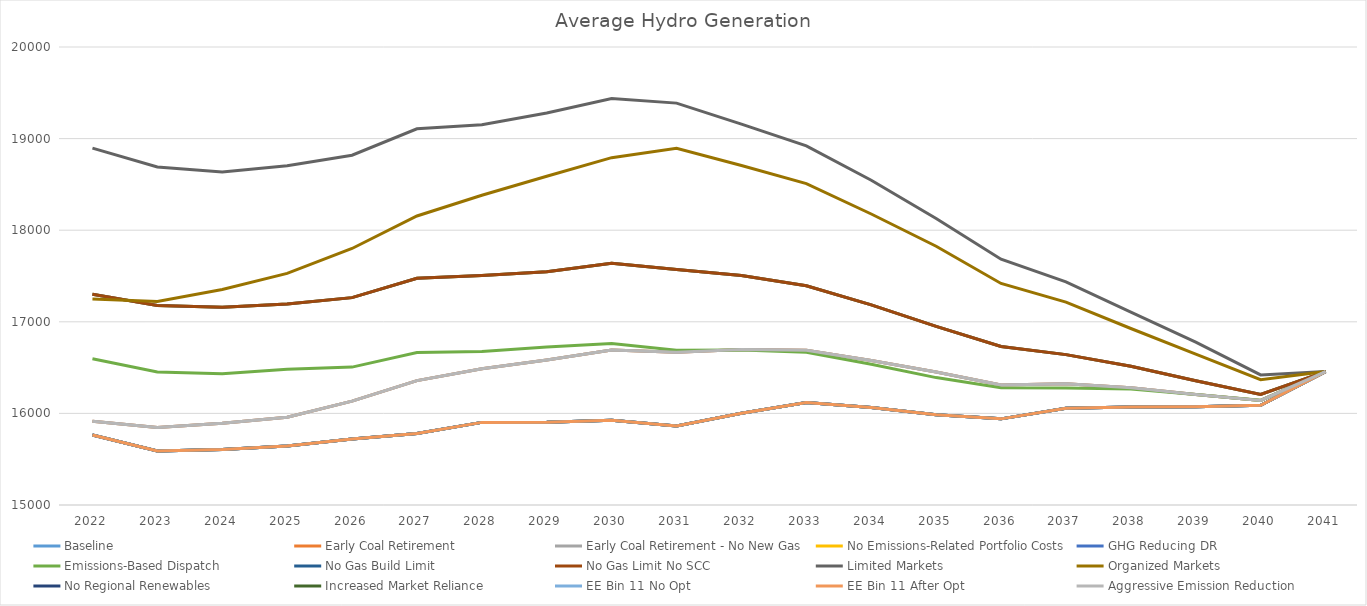
| Category | Baseline  | Early Coal Retirement | Early Coal Retirement - No New Gas | No Emissions-Related Portfolio Costs | GHG Reducing DR | Emissions-Based Dispatch | No Gas Build Limit | No Gas Limit No SCC | Limited Markets | Organized Markets | No Regional Renewables | Increased Market Reliance | EE Bin 11 No Opt | EE Bin 11 After Opt | Aggressive Emission Reduction |
|---|---|---|---|---|---|---|---|---|---|---|---|---|---|---|---|
| 2022.0 | 15764.597 | 15913.661 | 15913.661 | 17300.136 | 15764.597 | 16596.935 | 17300.136 | 17300.136 | 18896.162 | 17249.043 | 15764.597 | 15764.597 | 15764.597 | 15764.597 | 15913.661 |
| 2023.0 | 15589.564 | 15846.044 | 15846.044 | 17179.11 | 15589.564 | 16451.572 | 17179.11 | 17179.11 | 18690.465 | 17220.585 | 15589.564 | 15589.564 | 15589.564 | 15589.564 | 15846.044 |
| 2024.0 | 15606.932 | 15892.932 | 15892.932 | 17157.839 | 15606.932 | 16433.091 | 17157.839 | 17157.839 | 18634.977 | 17353.576 | 15606.932 | 15606.932 | 15606.932 | 15606.932 | 15892.932 |
| 2025.0 | 15645.328 | 15958.127 | 15958.127 | 17195.266 | 15645.328 | 16481.959 | 17195.266 | 17195.266 | 18704.343 | 17528.263 | 15645.328 | 15645.328 | 15645.328 | 15645.328 | 15958.127 |
| 2026.0 | 15720.863 | 16133.783 | 16133.783 | 17263.757 | 15720.863 | 16505.414 | 17263.757 | 17263.757 | 18818.205 | 17800.334 | 15720.863 | 15720.863 | 15720.863 | 15720.863 | 16133.783 |
| 2027.0 | 15781.453 | 16357.743 | 16357.743 | 17475.796 | 15781.453 | 16664.855 | 17475.796 | 17475.796 | 19106.494 | 18155.148 | 15781.453 | 15781.453 | 15781.453 | 15781.453 | 16357.743 |
| 2028.0 | 15901.912 | 16487.674 | 16487.674 | 17506.134 | 15901.912 | 16677.015 | 17506.134 | 17506.134 | 19151.837 | 18380.942 | 15901.912 | 15901.912 | 15901.912 | 15901.912 | 16487.674 |
| 2029.0 | 15904.097 | 16584.062 | 16584.062 | 17545.731 | 15904.097 | 16723.724 | 17545.731 | 17545.731 | 19278.886 | 18588.332 | 15904.097 | 15904.097 | 15904.097 | 15904.097 | 16584.062 |
| 2030.0 | 15925.936 | 16693.216 | 16693.216 | 17639.091 | 15925.936 | 16762.705 | 17639.091 | 17639.091 | 19437.517 | 18791.695 | 15925.936 | 15925.936 | 15925.936 | 15925.936 | 16693.216 |
| 2031.0 | 15863.542 | 16668.426 | 16668.426 | 17571.982 | 15863.542 | 16690.499 | 17571.982 | 17571.982 | 19387.307 | 18893.943 | 15863.542 | 15863.542 | 15863.542 | 15863.542 | 16668.426 |
| 2032.0 | 16001.218 | 16697.684 | 16697.684 | 17505.643 | 16001.218 | 16691.845 | 17505.643 | 17505.643 | 19158.258 | 18705.581 | 16001.218 | 16001.218 | 16001.218 | 16001.218 | 16697.684 |
| 2033.0 | 16117.6 | 16688.921 | 16688.921 | 17392.926 | 16117.6 | 16666.782 | 17392.926 | 17392.926 | 18919.761 | 18508.481 | 16117.6 | 16117.6 | 16117.6 | 16117.6 | 16688.921 |
| 2034.0 | 16065.268 | 16576.96 | 16576.96 | 17184.728 | 16065.268 | 16537.521 | 17184.728 | 17184.728 | 18545.022 | 18176.681 | 16065.268 | 16065.268 | 16065.268 | 16065.268 | 16576.96 |
| 2035.0 | 15984.088 | 16452.852 | 16452.852 | 16949.894 | 15984.088 | 16390.792 | 16949.894 | 16949.894 | 18128.598 | 17825.009 | 15984.088 | 15984.088 | 15984.088 | 15984.088 | 16452.852 |
| 2036.0 | 15940.429 | 16309.69 | 16309.69 | 16730.988 | 15940.429 | 16280.758 | 16730.988 | 16730.988 | 17683.861 | 17418.642 | 15940.429 | 15940.429 | 15940.429 | 15940.429 | 16309.69 |
| 2037.0 | 16056.62 | 16322.928 | 16322.928 | 16641.737 | 16056.62 | 16278.505 | 16641.737 | 16641.737 | 17435.314 | 17215.073 | 16056.62 | 16056.62 | 16056.62 | 16056.62 | 16322.928 |
| 2038.0 | 16068.726 | 16280.054 | 16280.054 | 16514.428 | 16068.726 | 16267.626 | 16514.428 | 16514.428 | 17105.74 | 16926.774 | 16068.726 | 16068.726 | 16068.726 | 16068.726 | 16280.054 |
| 2039.0 | 16072.789 | 16205.559 | 16205.559 | 16355.955 | 16072.789 | 16205.79 | 16355.955 | 16355.955 | 16778.468 | 16646.842 | 16072.789 | 16072.789 | 16072.789 | 16072.789 | 16205.559 |
| 2040.0 | 16089.281 | 16141.799 | 16141.799 | 16206.92 | 16089.281 | 16142.447 | 16206.92 | 16206.92 | 16419.983 | 16367.303 | 16089.281 | 16089.281 | 16089.281 | 16089.281 | 16141.799 |
| 2041.0 | 16456.846 | 16456.846 | 16456.846 | 16456.846 | 16456.846 | 16456.846 | 16456.846 | 16456.846 | 16456.846 | 16456.846 | 16456.846 | 16456.846 | 16456.846 | 16456.846 | 16456.846 |